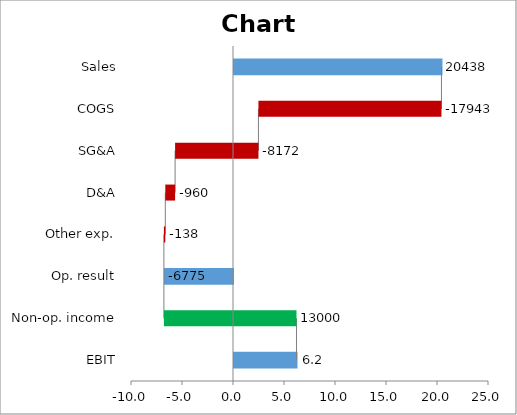
| Category | totals |
|---|---|
| Sales | 20438 |
| COGS | 0 |
| SG&A | 0 |
| D&A | 0 |
| Other exp. | 0 |
| Op. result | -6775 |
| Non-op. income | 0 |
| EBIT | 6225 |